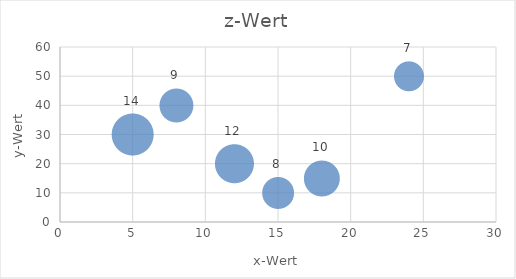
| Category | y-Wert |
|---|---|
| 5.0 | 30 |
| 24.0 | 50 |
| 12.0 | 20 |
| 18.0 | 15 |
| 15.0 | 10 |
| 8.0 | 40 |